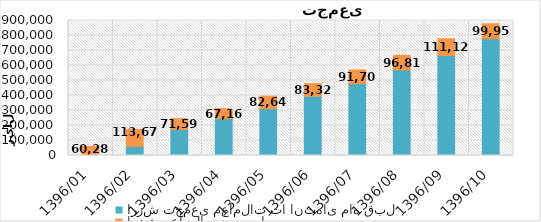
| Category | ارزش تجمعی معاملات تا انتهای ماه قبل | ارزش معاملات در هر ماه |
|---|---|---|
| 1396/01 | 0 | 60288 |
| 1396/02 | 60288 | 113671 |
| 1396/03 | 173959 | 71591 |
| 1396/04 | 245550 | 67162 |
| 1396/05 | 312712 | 82645 |
| 1396/06 | 395357 | 83323 |
| 1396/07 | 478680 | 91706 |
| 1396/08 | 570386 | 96819 |
| 1396/09 | 667205 | 111126 |
| 1396/10 | 778331 | 99950 |